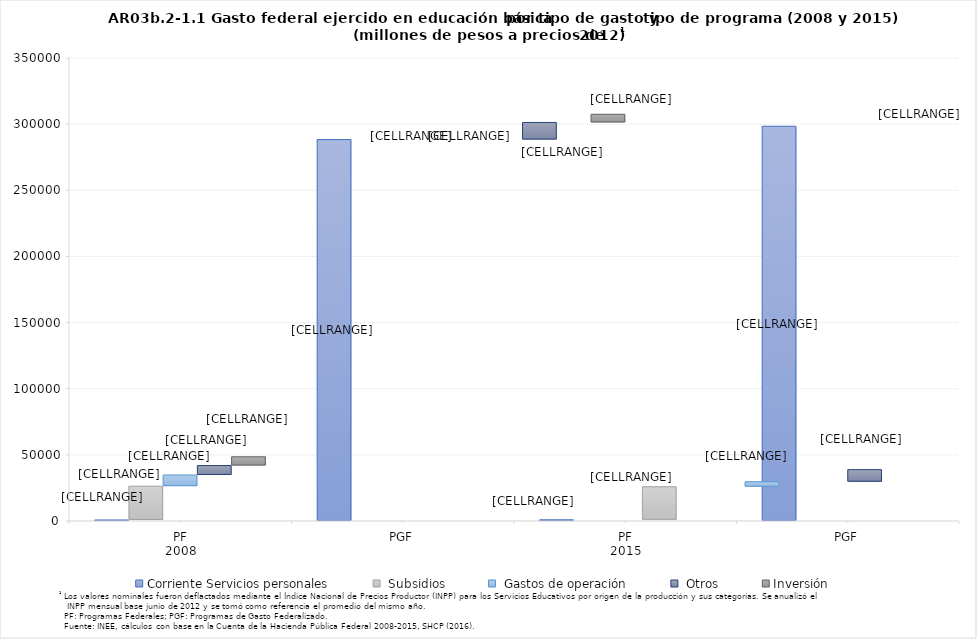
| Category | Corriente Servicios personales | Corriente Subsidios | Corriente Gastos de operación | Corriente Otros | Inversión |
|---|---|---|---|---|---|
| 0 | 784.1 | 25553.78 | 8456.47 | 7113.37 | 6620.69 |
| 1 | 288323.81 | 0 | 0 | 12949.99 | 6180.51 |
| 2 | 889.79 | 24996.48 | 3784.83 | 9141.75 | 2171.5 |
| 3 | 298401.87 | 0 | 0 | 28398.45 | 5642.46 |